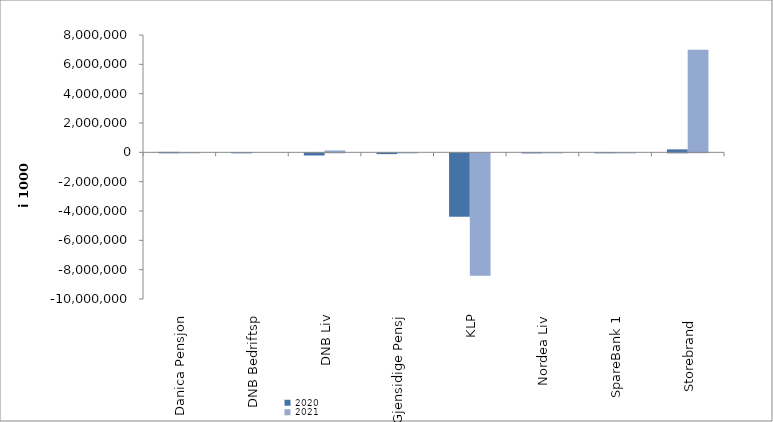
| Category | 2020 | 2021 |
|---|---|---|
| Danica Pensjon | 30468.184 | 3625.74 |
| DNB Bedriftsp | 3361 | 0 |
| DNB Liv | -148121 | 128120 |
| Gjensidige Pensj | -54118.6 | -5822 |
| KLP | -4327427.537 | -8346122.359 |
| Nordea Liv | -6168.538 | 137.296 |
| SpareBank 1 | 23.559 | -4778.64 |
| Storebrand  | 202498.867 | 6995598.233 |